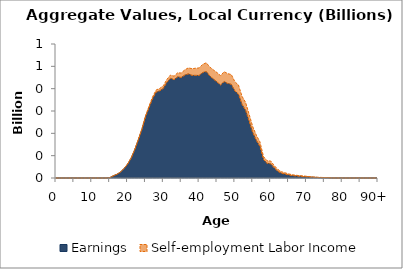
| Category | Earnings | Self-employment Labor Income |
|---|---|---|
| 0 | 0 | 0 |
|  | 0 | 0 |
| 2 | 0 | 0 |
| 3 | 0 | 0 |
| 4 | 0 | 0 |
| 5 | 0 | 0 |
| 6 | 0 | 0 |
| 7 | 0 | 0 |
| 8 | 0 | 0 |
| 9 | 0 | 0 |
| 10 | 0 | 0 |
| 11 | 0 | 0 |
| 12 | 0 | 0 |
| 13 | 0 | 0 |
| 14 | 0 | 0 |
| 15 | 1.239 | 0 |
| 16 | 9.772 | 0 |
| 17 | 16.371 | 0 |
| 18 | 26.093 | 0 |
| 19 | 42.24 | 0 |
| 20 | 61.969 | 0.777 |
| 21 | 88.921 | 1.131 |
| 22 | 126.058 | 1.659 |
| 23 | 170.527 | 2.397 |
| 24 | 216.823 | 3.409 |
| 25 | 272.829 | 4.972 |
| 26 | 315.168 | 6.57 |
| 27 | 355.19 | 8.318 |
| 28 | 384.399 | 9.896 |
| 29 | 390.252 | 10.83 |
| 30 | 401.125 | 11.897 |
| 31 | 428.298 | 13.382 |
| 32 | 446.267 | 14.774 |
| 33 | 440.092 | 15.829 |
| 34 | 452.895 | 18.082 |
| 35 | 449.947 | 20.237 |
| 36 | 460.703 | 23.453 |
| 37 | 466.009 | 27.252 |
| 38 | 459.436 | 29.921 |
| 39 | 459.46 | 31.961 |
| 40 | 459.092 | 33.776 |
| 41 | 472.011 | 36.864 |
| 42 | 476.557 | 39.289 |
| 43 | 456.425 | 40.047 |
| 44 | 442.805 | 41.199 |
| 45 | 429.88 | 42.134 |
| 46 | 415.83 | 42.37 |
| 47 | 431.601 | 44.519 |
| 48 | 423.126 | 44.042 |
| 49 | 419.192 | 43.926 |
| 50 | 389.781 | 41.307 |
| 51 | 375.19 | 40.734 |
| 52 | 329.194 | 36.455 |
| 53 | 303.23 | 35.023 |
| 54 | 253.032 | 31.122 |
| 55 | 203.091 | 26.327 |
| 56 | 168.576 | 23.033 |
| 57 | 141.186 | 20.652 |
| 58 | 82.82 | 13.306 |
| 59 | 65.582 | 11.535 |
| 60 | 63.824 | 12.471 |
| 61 | 44.94 | 10.355 |
| 62 | 29.937 | 8.596 |
| 63 | 21.149 | 6.987 |
| 64 | 17.407 | 5.911 |
| 65 | 13.825 | 4.651 |
| 66 | 10.755 | 3.844 |
| 67 | 9.129 | 3.432 |
| 68 | 7.798 | 2.883 |
| 69 | 6.817 | 2.606 |
| 70 | 5.535 | 2.223 |
| 71 | 4.086 | 1.775 |
| 72 | 3.149 | 1.476 |
| 73 | 2.367 | 1.188 |
| 74 | 1.657 | 0.935 |
| 75 | 1.431 | 0.736 |
| 76 | 1.421 | 0.557 |
| 77 | 0.102 | 0.403 |
| 78 | 0.094 | 0.293 |
| 79 | 0 | 0.212 |
| 80 | 0 | 0.159 |
| 81 | 0 | 0.111 |
| 82 | 0 | 0.078 |
| 83 | 0 | 0.047 |
| 84 | 0.159 | 0.028 |
| 85 | 0 | 0.009 |
| 86 | 0 | 0.001 |
| 87 | 0 | 0 |
| 88 | 0 | 0 |
| 89 | 0 | 0 |
| 90+ | 0 | 0 |